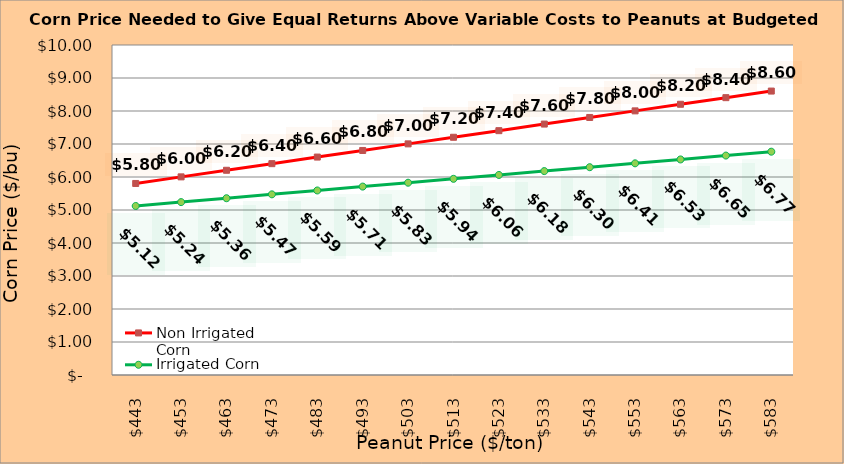
| Category | Non Irrigated Corn | Irrigated Corn |
|---|---|---|
| 442.5 | 5.804 | 5.122 |
| 452.5 | 6.004 | 5.239 |
| 462.5 | 6.204 | 5.357 |
| 472.5 | 6.404 | 5.474 |
| 482.5 | 6.604 | 5.592 |
| 492.5 | 6.804 | 5.709 |
| 502.5 | 7.004 | 5.827 |
| 512.5 | 7.204 | 5.944 |
| 522.5 | 7.404 | 6.062 |
| 532.5 | 7.604 | 6.179 |
| 542.5 | 7.804 | 6.297 |
| 552.5 | 8.004 | 6.414 |
| 562.5 | 8.204 | 6.532 |
| 572.5 | 8.404 | 6.649 |
| 582.5 | 8.604 | 6.767 |